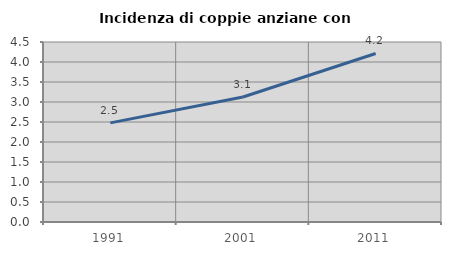
| Category | Incidenza di coppie anziane con figli |
|---|---|
| 1991.0 | 2.478 |
| 2001.0 | 3.125 |
| 2011.0 | 4.213 |